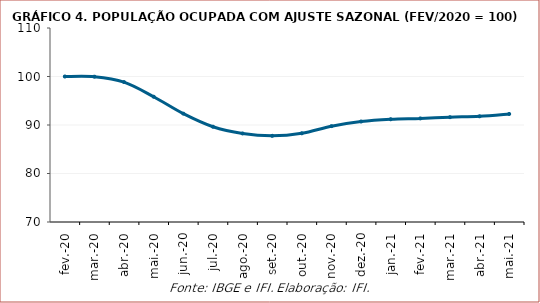
| Category | PO |
|---|---|
| 2020-02-01 | 100 |
| 2020-03-01 | 99.962 |
| 2020-04-01 | 98.849 |
| 2020-05-01 | 95.827 |
| 2020-06-01 | 92.344 |
| 2020-07-01 | 89.649 |
| 2020-08-01 | 88.256 |
| 2020-09-01 | 87.766 |
| 2020-10-01 | 88.292 |
| 2020-11-01 | 89.761 |
| 2020-12-01 | 90.718 |
| 2021-01-01 | 91.183 |
| 2021-02-01 | 91.357 |
| 2021-03-01 | 91.615 |
| 2021-04-01 | 91.791 |
| 2021-05-01 | 92.271 |